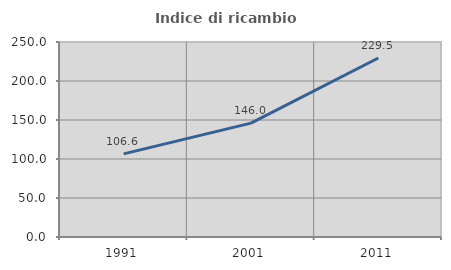
| Category | Indice di ricambio occupazionale  |
|---|---|
| 1991.0 | 106.588 |
| 2001.0 | 146.02 |
| 2011.0 | 229.466 |